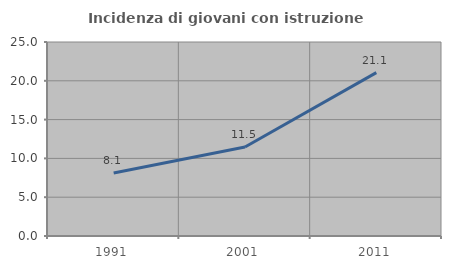
| Category | Incidenza di giovani con istruzione universitaria |
|---|---|
| 1991.0 | 8.108 |
| 2001.0 | 11.475 |
| 2011.0 | 21.053 |